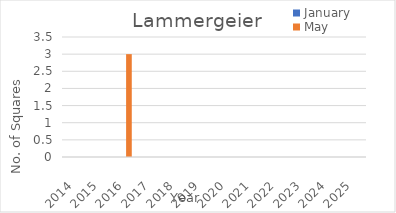
| Category | January | May |
|---|---|---|
| 2014.0 | 0 | 0 |
| 2015.0 | 0 | 0 |
| 2016.0 | 0 | 3 |
| 2017.0 | 0 | 0 |
| 2018.0 | 0 | 0 |
| 2019.0 | 0 | 0 |
| 2020.0 | 0 | 0 |
| 2021.0 | 0 | 0 |
| 2022.0 | 0 | 0 |
| 2023.0 | 0 | 0 |
| 2024.0 | 0 | 0 |
| 2025.0 | 0 | 0 |